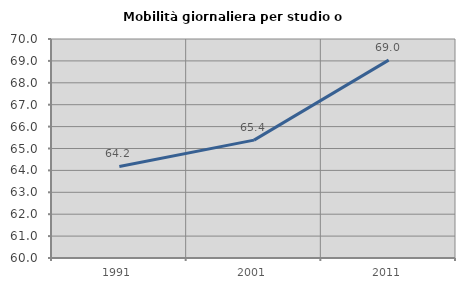
| Category | Mobilità giornaliera per studio o lavoro |
|---|---|
| 1991.0 | 64.179 |
| 2001.0 | 65.383 |
| 2011.0 | 69.035 |